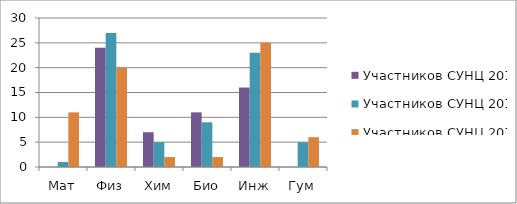
| Category | Участников СУНЦ 2016 | Участников СУНЦ 2017 | Участников СУНЦ 2018 |
|---|---|---|---|
| Мат | 0 | 1 | 11 |
| Физ | 24 | 27 | 20 |
| Хим | 7 | 5 | 2 |
| Био | 11 | 9 | 2 |
| Инж | 16 | 23 | 25 |
| Гум | 0 | 5 | 6 |